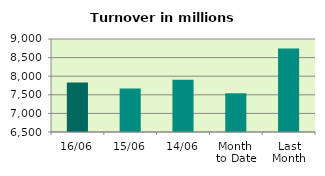
| Category | Series 0 |
|---|---|
| 16/06 | 7830.227 |
| 15/06 | 7666.944 |
| 14/06 | 7905.234 |
| Month 
to Date | 7541.083 |
| Last
Month | 8745.898 |